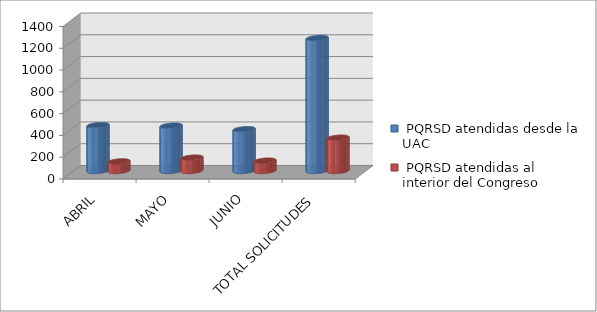
| Category |  PQRSD atendidas desde la UAC |  PQRSD atendidas al interior del Congreso |
|---|---|---|
| ABRIL | 421 | 88 |
| MAYO | 416 | 123 |
| JUNIO | 384 | 95 |
| TOTAL SOLICITUDES | 1221 | 306 |